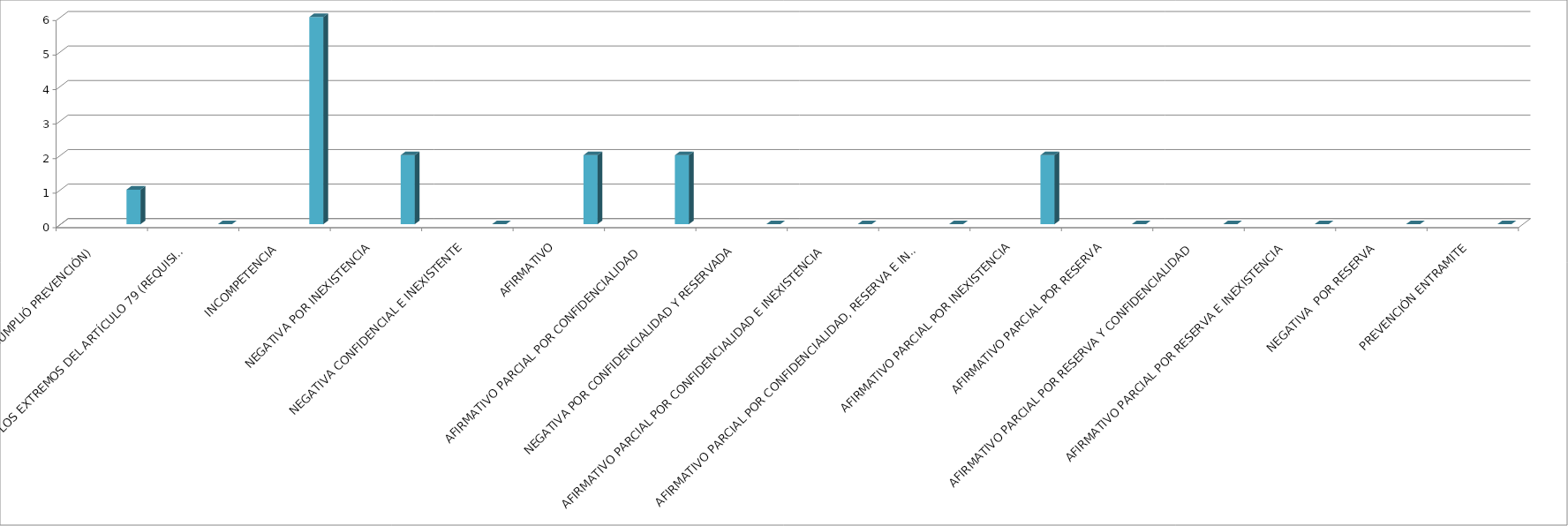
| Category | Series 0 | Series 1 | Series 2 | Series 3 | Series 4 |
|---|---|---|---|---|---|
| SE TIENE POR NO PRESENTADA ( NO CUMPLIÓ PREVENCIÓN) |  |  |  |  | 1 |
| NO CUMPLIO CON LOS EXTREMOS DEL ARTÍCULO 79 (REQUISITOS) |  |  |  |  | 0 |
| INCOMPETENCIA  |  |  |  |  | 6 |
| NEGATIVA POR INEXISTENCIA |  |  |  |  | 2 |
| NEGATIVA CONFIDENCIAL E INEXISTENTE |  |  |  |  | 0 |
| AFIRMATIVO |  |  |  |  | 2 |
| AFIRMATIVO PARCIAL POR CONFIDENCIALIDAD  |  |  |  |  | 2 |
| NEGATIVA POR CONFIDENCIALIDAD Y RESERVADA |  |  |  |  | 0 |
| AFIRMATIVO PARCIAL POR CONFIDENCIALIDAD E INEXISTENCIA |  |  |  |  | 0 |
| AFIRMATIVO PARCIAL POR CONFIDENCIALIDAD, RESERVA E INEXISTENCIA |  |  |  |  | 0 |
| AFIRMATIVO PARCIAL POR INEXISTENCIA |  |  |  |  | 2 |
| AFIRMATIVO PARCIAL POR RESERVA |  |  |  |  | 0 |
| AFIRMATIVO PARCIAL POR RESERVA Y CONFIDENCIALIDAD |  |  |  |  | 0 |
| AFIRMATIVO PARCIAL POR RESERVA E INEXISTENCIA |  |  |  |  | 0 |
| NEGATIVA  POR RESERVA |  |  |  |  | 0 |
| PREVENCIÓN ENTRAMITE |  |  |  |  | 0 |